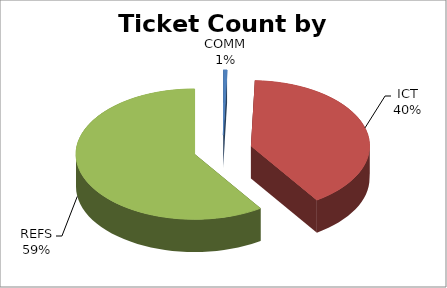
| Category | Series 0 |
|---|---|
| COMM | 58 |
| ICT | 4457 |
| REFS | 6601 |